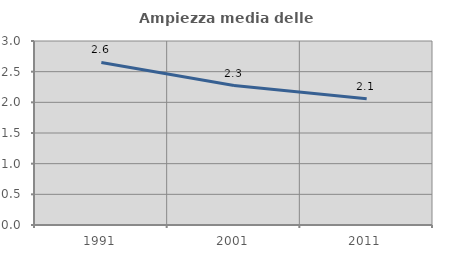
| Category | Ampiezza media delle famiglie |
|---|---|
| 1991.0 | 2.65 |
| 2001.0 | 2.273 |
| 2011.0 | 2.058 |